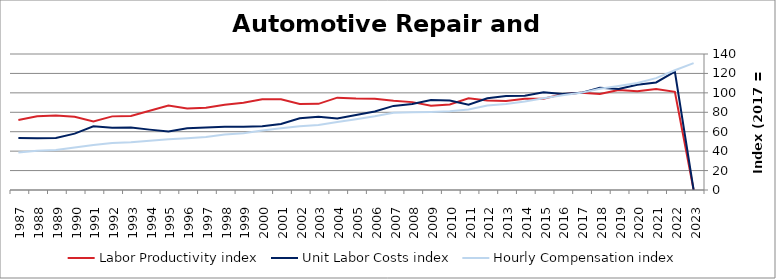
| Category | Labor Productivity index | Unit Labor Costs index | Hourly Compensation index |
|---|---|---|---|
| 2023.0 | 0 | 0 | 130.655 |
| 2022.0 | 101.091 | 121.905 | 123.235 |
| 2021.0 | 104.001 | 110.736 | 115.167 |
| 2020.0 | 101.568 | 108.379 | 110.079 |
| 2019.0 | 102.924 | 104.068 | 107.111 |
| 2018.0 | 98.862 | 105.324 | 104.126 |
| 2017.0 | 100 | 100 | 100 |
| 2016.0 | 98.682 | 98.891 | 97.588 |
| 2015.0 | 93.982 | 100.572 | 94.519 |
| 2014.0 | 93.847 | 97.029 | 91.06 |
| 2013.0 | 91.509 | 96.643 | 88.437 |
| 2012.0 | 92.033 | 94.401 | 86.88 |
| 2011.0 | 94.458 | 87.77 | 82.906 |
| 2010.0 | 88.007 | 92.106 | 81.06 |
| 2009.0 | 86.762 | 92.668 | 80.401 |
| 2008.0 | 90.458 | 88.596 | 80.142 |
| 2007.0 | 91.954 | 86.568 | 79.603 |
| 2006.0 | 93.94 | 80.804 | 75.908 |
| 2005.0 | 94.262 | 77.269 | 72.835 |
| 2004.0 | 95.06 | 73.652 | 70.014 |
| 2003.0 | 88.699 | 75.471 | 66.942 |
| 2002.0 | 88.655 | 73.924 | 65.537 |
| 2001.0 | 93.324 | 68.039 | 63.497 |
| 2000.0 | 93.358 | 65.647 | 61.286 |
| 1999.0 | 89.787 | 64.988 | 58.35 |
| 1998.0 | 87.802 | 65.101 | 57.16 |
| 1997.0 | 84.683 | 64.461 | 54.588 |
| 1996.0 | 83.952 | 63.599 | 53.393 |
| 1995.0 | 86.86 | 60.232 | 52.317 |
| 1994.0 | 81.581 | 62.148 | 50.701 |
| 1993.0 | 76.199 | 64.429 | 49.094 |
| 1992.0 | 75.791 | 63.971 | 48.484 |
| 1991.0 | 70.619 | 65.643 | 46.356 |
| 1990.0 | 75.341 | 58.015 | 43.709 |
| 1989.0 | 76.637 | 53.639 | 41.107 |
| 1988.0 | 75.911 | 53.36 | 40.506 |
| 1987.0 | 72.109 | 53.476 | 38.561 |